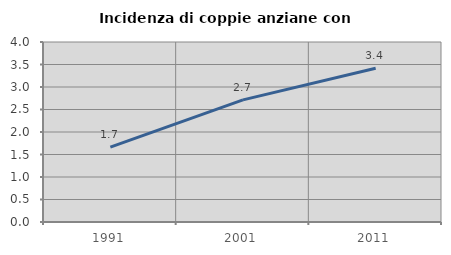
| Category | Incidenza di coppie anziane con figli |
|---|---|
| 1991.0 | 1.664 |
| 2001.0 | 2.714 |
| 2011.0 | 3.416 |